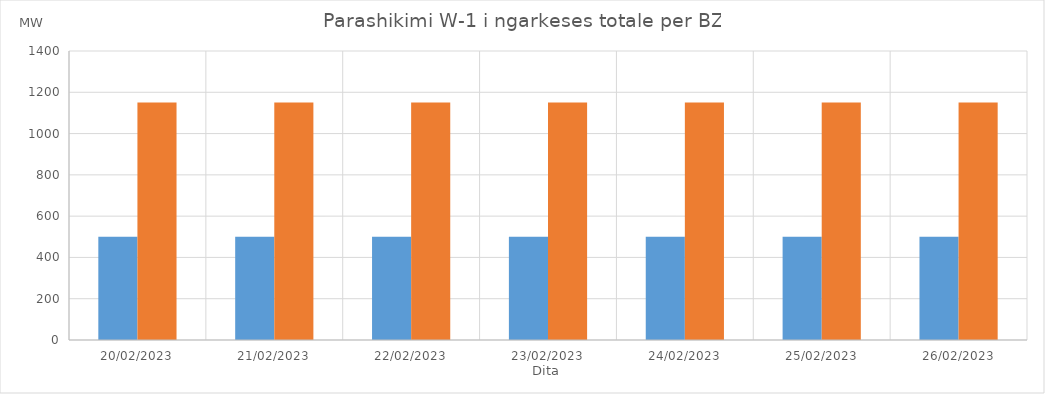
| Category | Min (MW) | Max (MW) |
|---|---|---|
| 20/02/2023 | 500 | 1150 |
| 21/02/2023 | 500 | 1150 |
| 22/02/2023 | 500 | 1150 |
| 23/02/2023 | 500 | 1150 |
| 24/02/2023 | 500 | 1150 |
| 25/02/2023 | 500 | 1150 |
| 26/02/2023 | 500 | 1150 |